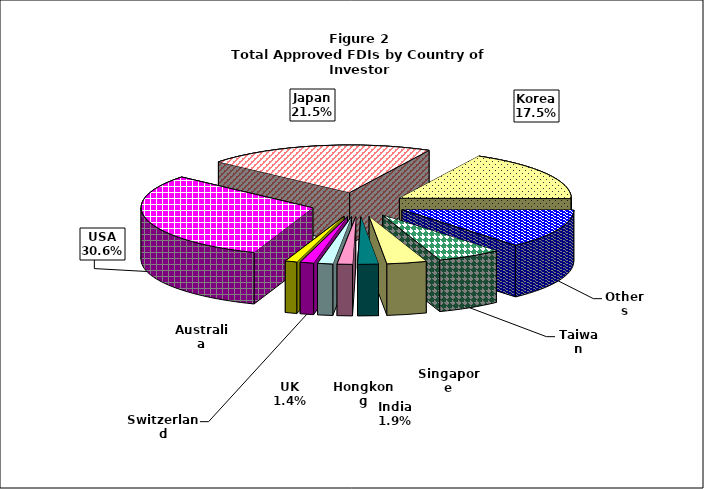
| Category | Series 0 |
|---|---|
| USA | 30.624 |
| Japan | 21.472 |
| Korea | 17.456 |
| Others | 13.396 |
| Taiwan | 6.109 |
| Singapore | 3.74 |
| India | 1.945 |
| Hongkong | 1.434 |
| UK | 1.432 |
| Switzerland | 1.277 |
| Australia | 1.115 |